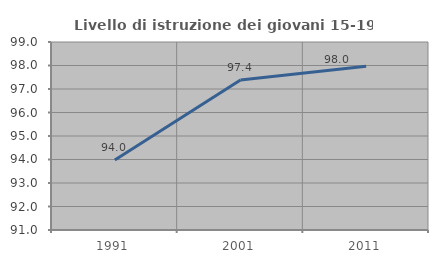
| Category | Livello di istruzione dei giovani 15-19 anni |
|---|---|
| 1991.0 | 93.976 |
| 2001.0 | 97.383 |
| 2011.0 | 97.972 |